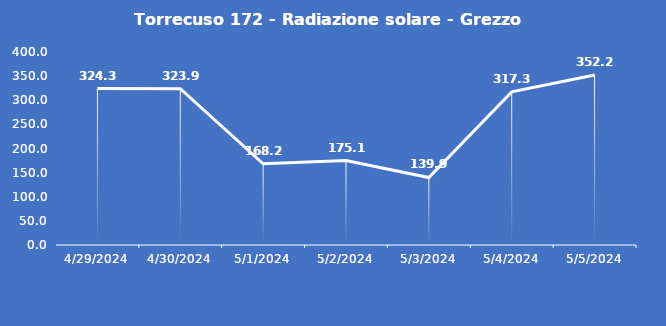
| Category | Torrecuso 172 - Radiazione solare - Grezzo (W/m2) |
|---|---|
| 4/29/24 | 324.3 |
| 4/30/24 | 323.9 |
| 5/1/24 | 168.2 |
| 5/2/24 | 175.1 |
| 5/3/24 | 139.9 |
| 5/4/24 | 317.3 |
| 5/5/24 | 352.2 |